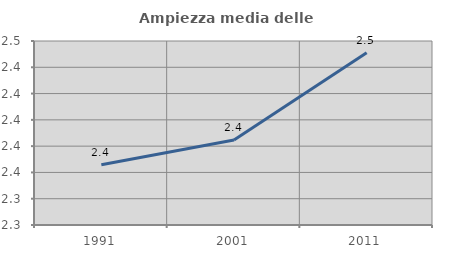
| Category | Ampiezza media delle famiglie |
|---|---|
| 1991.0 | 2.366 |
| 2001.0 | 2.385 |
| 2011.0 | 2.451 |